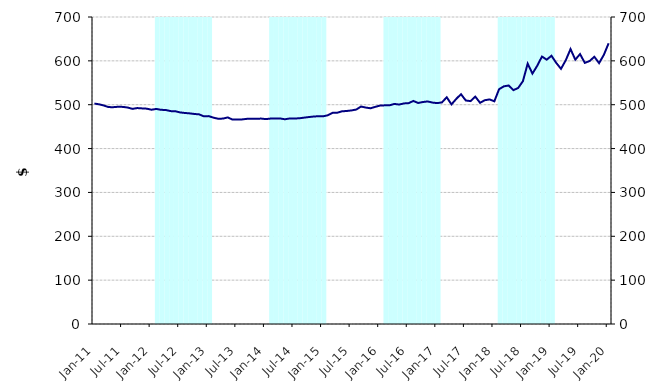
| Category | Series 1 |
|---|---|
| 0 | 0 |
| 1900-01-01 | 0 |
| 1900-01-02 | 0 |
| 1900-01-03 | 0 |
| 1900-01-04 | 0 |
| 1900-01-05 | 0 |
| 1900-01-06 | 0 |
| 1900-01-07 | 0 |
| 1900-01-08 | 0 |
| 1900-01-09 | 0 |
| 1900-01-10 | 0 |
| 1900-01-11 | 0 |
| 1900-01-12 | 0 |
| 1900-01-13 | 700000000 |
| 1900-01-14 | 700000000 |
| 1900-01-15 | 700000000 |
| 1900-01-16 | 700000000 |
| 1900-01-17 | 700000000 |
| 1900-01-18 | 700000000 |
| 1900-01-19 | 700000000 |
| 1900-01-20 | 700000000 |
| 1900-01-21 | 700000000 |
| 1900-01-22 | 700000000 |
| 1900-01-23 | 700000000 |
| 1900-01-24 | 700000000 |
| 1900-01-25 | 0 |
| 1900-01-26 | 0 |
| 1900-01-27 | 0 |
| 1900-01-28 | 0 |
| 1900-01-29 | 0 |
| 1900-01-30 | 0 |
| 1900-01-31 | 0 |
| 1900-02-01 | 0 |
| 1900-02-02 | 0 |
| 1900-02-03 | 0 |
| 1900-02-04 | 0 |
| 1900-02-05 | 0 |
| 1900-02-06 | 700000000 |
| 1900-02-07 | 700000000 |
| 1900-02-08 | 700000000 |
| 1900-02-09 | 700000000 |
| 1900-02-10 | 700000000 |
| 1900-02-11 | 700000000 |
| 1900-02-12 | 700000000 |
| 1900-02-13 | 700000000 |
| 1900-02-14 | 700000000 |
| 1900-02-15 | 700000000 |
| 1900-02-16 | 700000000 |
| 1900-02-17 | 700000000 |
| 1900-02-18 | 0 |
| 1900-02-19 | 0 |
| 1900-02-20 | 0 |
| 1900-02-21 | 0 |
| 1900-02-22 | 0 |
| 1900-02-23 | 0 |
| 1900-02-24 | 0 |
| 1900-02-25 | 0 |
| 1900-02-26 | 0 |
| 1900-02-27 | 0 |
| 1900-02-28 | 0 |
| 1900-02-28 | 0 |
| 1900-03-01 | 700000000 |
| 1900-03-02 | 700000000 |
| 1900-03-03 | 700000000 |
| 1900-03-04 | 700000000 |
| 1900-03-05 | 700000000 |
| 1900-03-06 | 700000000 |
| 1900-03-07 | 700000000 |
| 1900-03-08 | 700000000 |
| 1900-03-09 | 700000000 |
| 1900-03-10 | 700000000 |
| 1900-03-11 | 700000000 |
| 1900-03-12 | 700000000 |
| 1900-03-13 | 0 |
| 1900-03-14 | 0 |
| 1900-03-15 | 0 |
| 1900-03-16 | 0 |
| 1900-03-17 | 0 |
| 1900-03-18 | 0 |
| 1900-03-19 | 0 |
| 1900-03-20 | 0 |
| 1900-03-21 | 0 |
| 1900-03-22 | 0 |
| 1900-03-23 | 0 |
| 1900-03-24 | 0 |
| 1900-03-25 | 700000000 |
| 1900-03-26 | 700000000 |
| 1900-03-27 | 700000000 |
| 1900-03-28 | 700000000 |
| 1900-03-29 | 700000000 |
| 1900-03-30 | 700000000 |
| 1900-03-31 | 700000000 |
| 1900-04-01 | 700000000 |
| 1900-04-02 | 700000000 |
| 1900-04-03 | 700000000 |
| 1900-04-04 | 700000000 |
| 1900-04-05 | 700000000 |
| 1900-04-06 | 0 |
| 1900-04-07 | 0 |
| 1900-04-08 | 0 |
| 1900-04-09 | 0 |
| 1900-04-10 | 0 |
| 1900-04-11 | 0 |
| 1900-04-12 | 0 |
| 1900-04-13 | 0 |
| 1900-04-14 | 0 |
| 1900-04-15 | 0 |
| 1900-04-16 | 0 |
| 1900-04-17 | 0 |